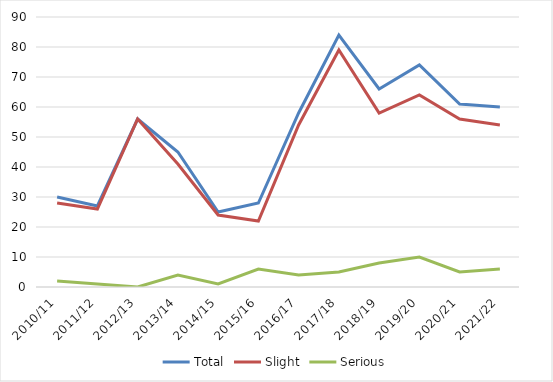
| Category | Total | Slight | Serious |
|---|---|---|---|
| 2010/11 | 30 | 28 | 2 |
| 2011/12 | 27 | 26 | 1 |
| 2012/13 | 56 | 56 | 0 |
| 2013/14 | 45 | 41 | 4 |
| 2014/15 | 25 | 24 | 1 |
| 2015/16 | 28 | 22 | 6 |
| 2016/17 | 58 | 54 | 4 |
| 2017/18 | 84 | 79 | 5 |
| 2018/19 | 66 | 58 | 8 |
| 2019/20 | 74 | 64 | 10 |
| 2020/21 | 61 | 56 | 5 |
| 2021/22 | 60 | 54 | 6 |